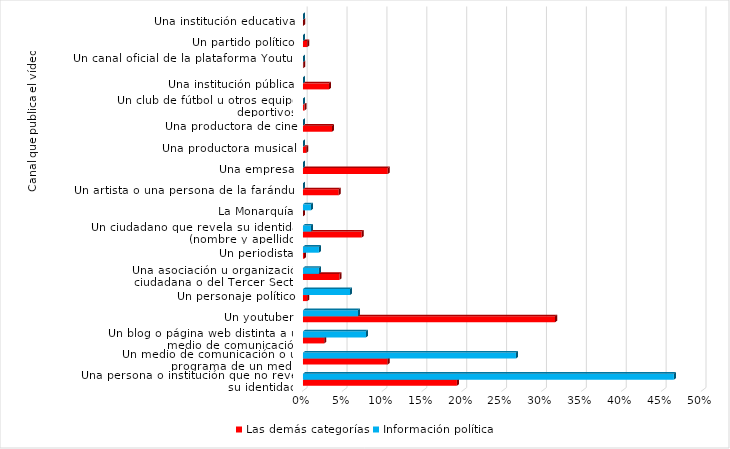
| Category | Las demás categorías | Información política |
|---|---|---|
| Una persona o institución que no revela su identidad | 0.193 | 0.465 |
| Un medio de comunicación o un programa de un medio | 0.106 | 0.267 |
| Un blog o página web distinta a un medio de comunicación | 0.027 | 0.079 |
| Un youtuber | 0.316 | 0.069 |
| Un personaje político | 0.005 | 0.059 |
| Una asociación u organización ciudadana o del Tercer Sector | 0.046 | 0.02 |
| Un periodista | 0.001 | 0.02 |
| Un ciudadano que revela su identidad (nombre y apellido) | 0.074 | 0.01 |
| La Monarquía | 0 | 0.01 |
| Un artista o una persona de la farándula | 0.045 | 0 |
| Una empresa | 0.106 | 0 |
| Una productora musical | 0.004 | 0 |
| Una productora de cine | 0.036 | 0 |
| Un club de fútbol u otros equipos deportivos | 0.002 | 0 |
| Una institución pública | 0.033 | 0 |
| Un canal oficial de la plataforma Youtube | 0 | 0 |
| Un partido político | 0.005 | 0 |
| Una institución educativa | 0 | 0 |